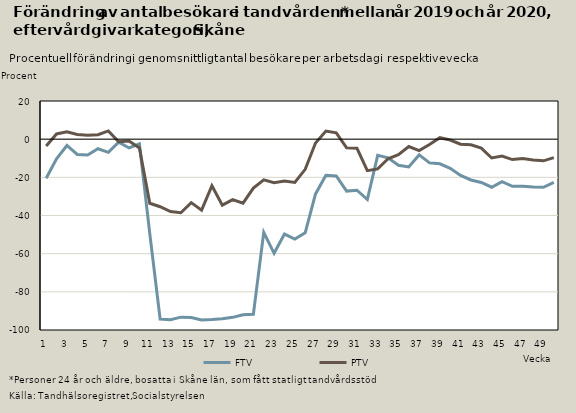
| Category | FTV | PTV |
|---|---|---|
| 0 | -20.487 | -3.594 |
| 1 | -10.313 | 2.74 |
| 2 | -3.299 | 3.894 |
| 3 | -7.994 | 2.466 |
| 4 | -8.286 | 1.993 |
| 5 | -5.002 | 2.309 |
| 6 | -6.914 | 4.329 |
| 7 | -1.539 | -1.363 |
| 8 | -4.604 | -1.022 |
| 9 | -2.516 | -4.611 |
| 10 | -49.489 | -33.58 |
| 11 | -94.269 | -35.39 |
| 12 | -94.635 | -37.941 |
| 13 | -93.259 | -38.55 |
| 14 | -93.474 | -33.261 |
| 15 | -94.76 | -37.181 |
| 16 | -94.512 | -24.372 |
| 17 | -94.106 | -34.59 |
| 18 | -93.363 | -31.668 |
| 19 | -91.991 | -33.526 |
| 20 | -91.739 | -25.633 |
| 21 | -48.837 | -21.352 |
| 22 | -59.812 | -22.827 |
| 23 | -49.72 | -21.981 |
| 24 | -52.316 | -22.69 |
| 25 | -49.062 | -15.823 |
| 26 | -28.681 | -1.973 |
| 27 | -18.895 | 4.269 |
| 28 | -19.241 | 3.32 |
| 29 | -27.209 | -4.564 |
| 30 | -26.732 | -4.782 |
| 31 | -31.621 | -16.482 |
| 32 | -8.453 | -15.576 |
| 33 | -9.801 | -10.269 |
| 34 | -13.697 | -8.078 |
| 35 | -14.584 | -3.858 |
| 36 | -8.255 | -5.964 |
| 37 | -12.413 | -2.803 |
| 38 | -12.924 | 0.762 |
| 39 | -15.241 | -0.459 |
| 40 | -19.03 | -2.666 |
| 41 | -21.377 | -2.938 |
| 42 | -22.698 | -4.703 |
| 43 | -25.183 | -9.854 |
| 44 | -22.305 | -8.868 |
| 45 | -24.725 | -10.706 |
| 46 | -24.693 | -10.17 |
| 47 | -25.039 | -10.929 |
| 48 | -25.25 | -11.365 |
| 49 | -22.649 | -9.646 |